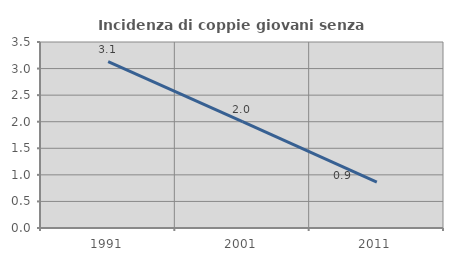
| Category | Incidenza di coppie giovani senza figli |
|---|---|
| 1991.0 | 3.133 |
| 2001.0 | 2.003 |
| 2011.0 | 0.862 |